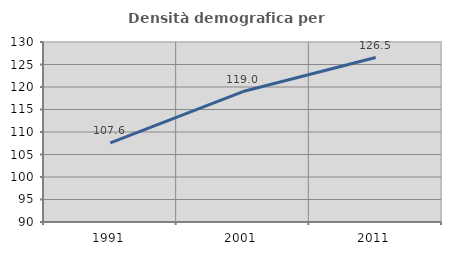
| Category | Densità demografica |
|---|---|
| 1991.0 | 107.591 |
| 2001.0 | 118.992 |
| 2011.0 | 126.544 |